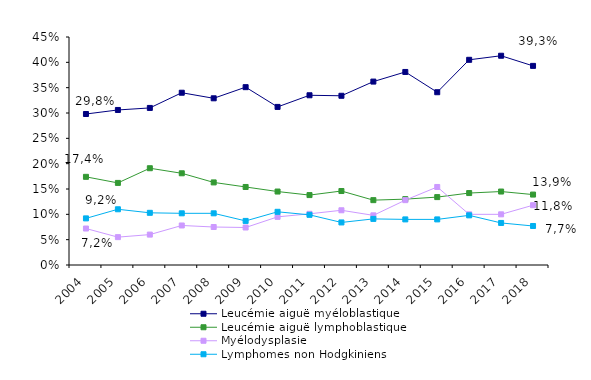
| Category | Leucémie aiguë myéloblastique | Leucémie aiguë lymphoblastique | Myélodysplasie | Lymphomes non Hodgkiniens |
|---|---|---|---|---|
| 2004.0 | 0.298 | 0.174 | 0.072 | 0.092 |
| 2005.0 | 0.306 | 0.162 | 0.055 | 0.11 |
| 2006.0 | 0.31 | 0.191 | 0.06 | 0.103 |
| 2007.0 | 0.34 | 0.181 | 0.078 | 0.102 |
| 2008.0 | 0.329 | 0.163 | 0.075 | 0.102 |
| 2009.0 | 0.351 | 0.154 | 0.074 | 0.087 |
| 2010.0 | 0.312 | 0.145 | 0.095 | 0.105 |
| 2011.0 | 0.335 | 0.138 | 0.101 | 0.099 |
| 2012.0 | 0.334 | 0.146 | 0.108 | 0.084 |
| 2013.0 | 0.362 | 0.128 | 0.098 | 0.091 |
| 2014.0 | 0.381 | 0.13 | 0.128 | 0.09 |
| 2015.0 | 0.341 | 0.134 | 0.154 | 0.09 |
| 2016.0 | 0.405 | 0.142 | 0.1 | 0.098 |
| 2017.0 | 0.413 | 0.145 | 0.1 | 0.083 |
| 2018.0 | 0.393 | 0.139 | 0.118 | 0.077 |